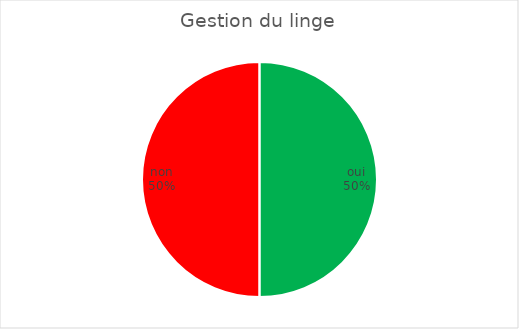
| Category | Gestion du linge |
|---|---|
| oui | 5 |
| non | 5 |